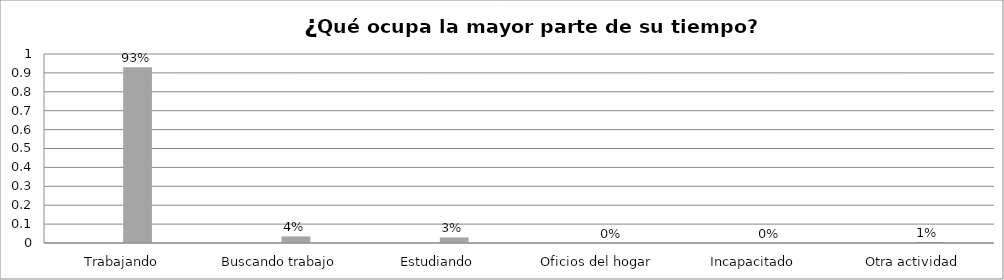
| Category | Series 0 | Series 1 | Series 2 | Series 3 |
|---|---|---|---|---|
| Trabajando |  |  | 0.93 |  |
| Buscando trabajo |  |  | 0.035 |  |
| Estudiando |  |  | 0.029 |  |
| Oficios del hogar |  |  | 0 |  |
| Incapacitado  |  |  | 0 |  |
| Otra actividad |  |  | 0.006 |  |